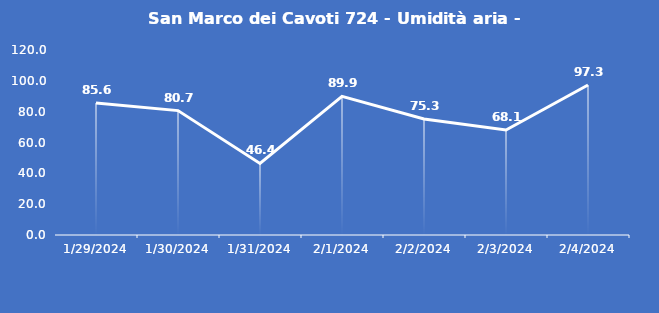
| Category | San Marco dei Cavoti 724 - Umidità aria - Grezzo (%) |
|---|---|
| 1/29/24 | 85.6 |
| 1/30/24 | 80.7 |
| 1/31/24 | 46.4 |
| 2/1/24 | 89.9 |
| 2/2/24 | 75.3 |
| 2/3/24 | 68.1 |
| 2/4/24 | 97.3 |